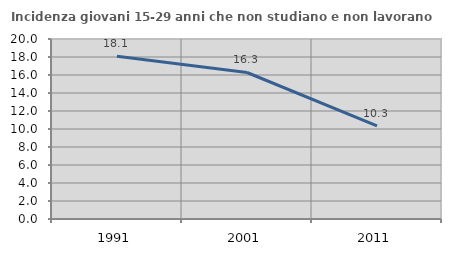
| Category | Incidenza giovani 15-29 anni che non studiano e non lavorano  |
|---|---|
| 1991.0 | 18.085 |
| 2001.0 | 16.279 |
| 2011.0 | 10.345 |